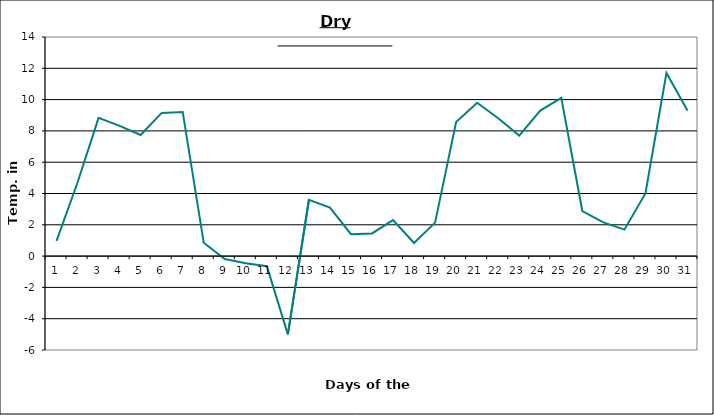
| Category | Series 0 |
|---|---|
| 0 | 0.97 |
| 1 | 4.7 |
| 2 | 8.83 |
| 3 | 8.32 |
| 4 | 7.74 |
| 5 | 9.15 |
| 6 | 9.21 |
| 7 | 0.85 |
| 8 | -0.19 |
| 9 | -0.46 |
| 10 | -0.65 |
| 11 | -5 |
| 12 | 3.6 |
| 13 | 3.1 |
| 14 | 1.4 |
| 15 | 1.45 |
| 16 | 2.3 |
| 17 | 0.84 |
| 18 | 2.14 |
| 19 | 8.57 |
| 20 | 9.8 |
| 21 | 8.81 |
| 22 | 7.7 |
| 23 | 9.3 |
| 24 | 10.11 |
| 25 | 2.88 |
| 26 | 2.15 |
| 27 | 1.69 |
| 28 | 4 |
| 29 | 11.7 |
| 30 | 9.3 |